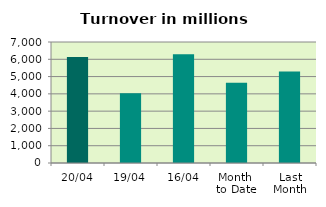
| Category | Series 0 |
|---|---|
| 20/04 | 6127.701 |
| 19/04 | 4040.568 |
| 16/04 | 6295.229 |
| Month 
to Date | 4649.438 |
| Last
Month | 5289.077 |